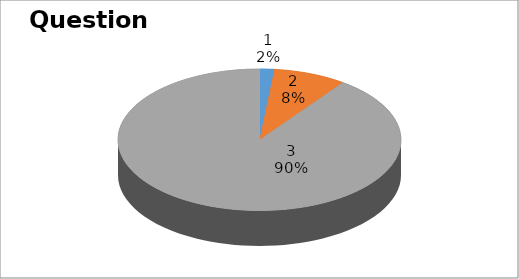
| Category | Series 0 |
|---|---|
| 0 | 1 |
| 1 | 5 |
| 2 | 54 |